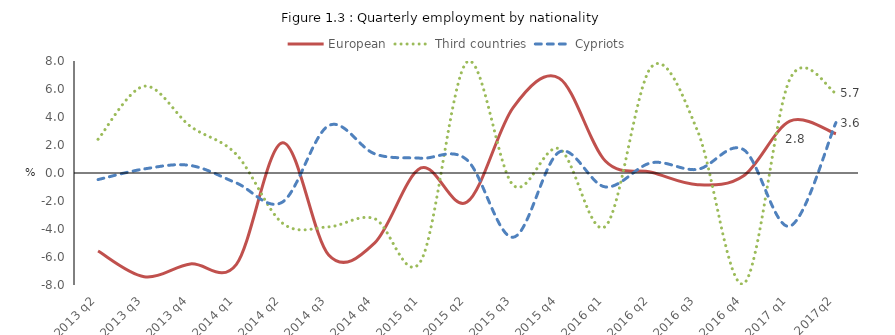
| Category | European | Third countries |
|---|---|---|
| 2013 q2 | -5.576 | 2.408 |
| 2013 q3 | -7.407 | 6.199 |
| 2013 q4 | -6.497 | 3.344 |
| 2014 q1 | -6.522 | 1.323 |
| 2014 q2 | 2.166 | -3.585 |
| 2014 q3 | -5.852 | -3.846 |
| 2014 q4 | -4.99 | -3.269 |
| 2015 q1 | 0.357 | -6.28 |
| 2015 q2 | -2.08 | 7.932 |
| 2015 q3 | 4.677 | -0.86 |
| 2015 q4 | 6.772 | 1.731 |
| 2016 q1 | 0.854 | -3.815 |
| 2016 q2 | 0.049 | 7.584 |
| 2016 q3 | -0.835 | 3.003 |
| 2016 q4 | -0.194 | -7.9 |
| 2017 q1 | 3.7 | 6.7 |
| 2017q2 | 2.8 | 5.7 |